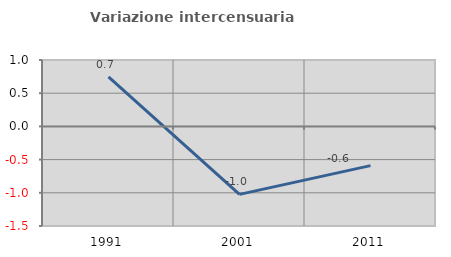
| Category | Variazione intercensuaria annua |
|---|---|
| 1991.0 | 0.746 |
| 2001.0 | -1.023 |
| 2011.0 | -0.591 |